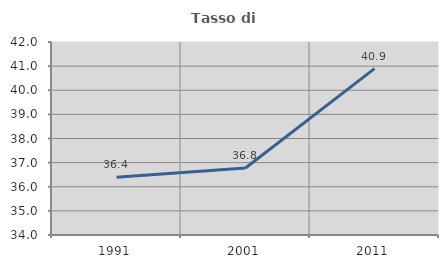
| Category | Tasso di occupazione   |
|---|---|
| 1991.0 | 36.395 |
| 2001.0 | 36.776 |
| 2011.0 | 40.896 |